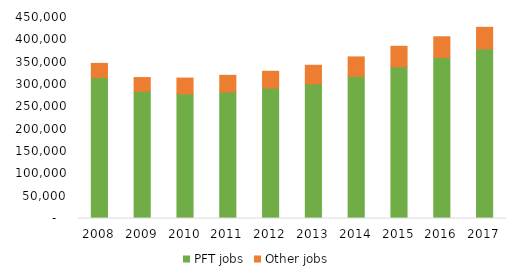
| Category | PFT jobs | Other jobs |
|---|---|---|
| 2008.0 | 315470 | 31759 |
| 2009.0 | 284818 | 30722 |
| 2010.0 | 279102 | 35302 |
| 2011.0 | 283185 | 37281 |
| 2012.0 | 291971 | 37614 |
| 2013.0 | 301472 | 41569 |
| 2014.0 | 318257 | 43473 |
| 2015.0 | 339632 | 45874 |
| 2016.0 | 360441 | 46425 |
| 2017.0 | 379810 | 48221 |